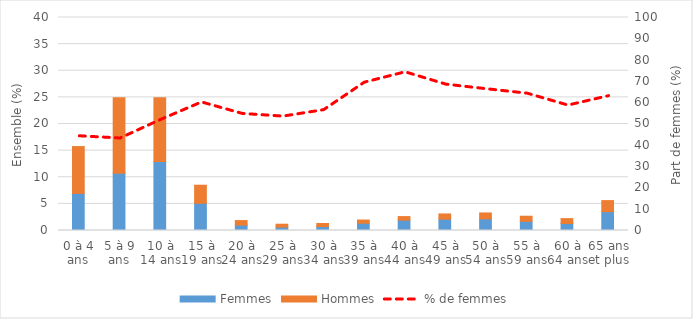
| Category | Femmes | Hommes |
|---|---|---|
| 0 à 4 ans | 6.97 | 8.789 |
| 5 à 9 ans | 10.769 | 14.161 |
| 10 à 14 ans | 12.956 | 11.98 |
| 15 à 19 ans | 5.113 | 3.391 |
| 20 à 24 ans | 1.02 | 0.843 |
| 25 à 29 ans | 0.631 | 0.549 |
| 30 à 34 ans | 0.74 | 0.57 |
| 35 à 39 ans | 1.365 | 0.601 |
| 40 à 44 ans | 1.943 | 0.673 |
| 45 à 49 ans | 2.13 | 0.98 |
| 50 à 54 ans | 2.187 | 1.11 |
| 55 à 59 ans | 1.722 | 0.959 |
| 60 à 64 ans | 1.31 | 0.923 |
| 65 ans et plus | 3.543 | 2.073 |